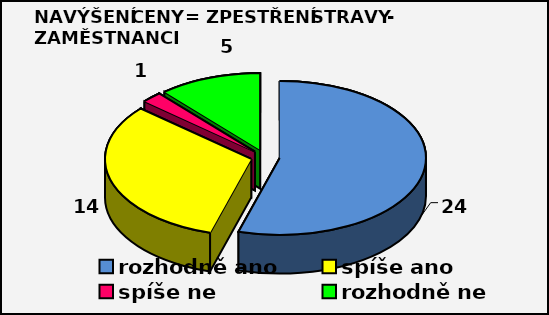
| Category | Series 0 |
|---|---|
| rozhodně ano | 24 |
| spíše ano | 14 |
| spíše ne  | 1 |
| rozhodně ne  | 5 |